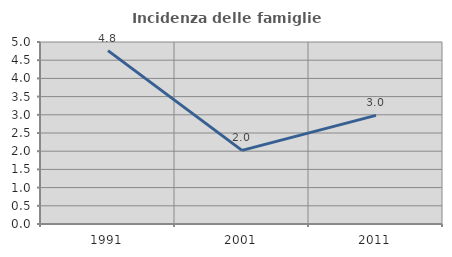
| Category | Incidenza delle famiglie numerose |
|---|---|
| 1991.0 | 4.762 |
| 2001.0 | 2.023 |
| 2011.0 | 2.985 |